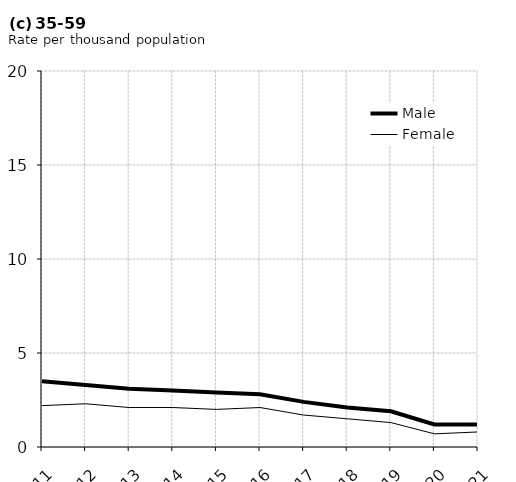
| Category | Male | Female |
|---|---|---|
| 2011.0 | 3.5 | 2.2 |
| 2012.0 | 3.3 | 2.3 |
| 2013.0 | 3.1 | 2.1 |
| 2014.0 | 3 | 2.1 |
| 2015.0 | 2.9 | 2 |
| 2016.0 | 2.8 | 2.1 |
| 2017.0 | 2.4 | 1.7 |
| 2018.0 | 2.1 | 1.5 |
| 2019.0 | 1.9 | 1.3 |
| 2020.0 | 1.2 | 0.7 |
| 2021.0 | 1.2 | 0.8 |